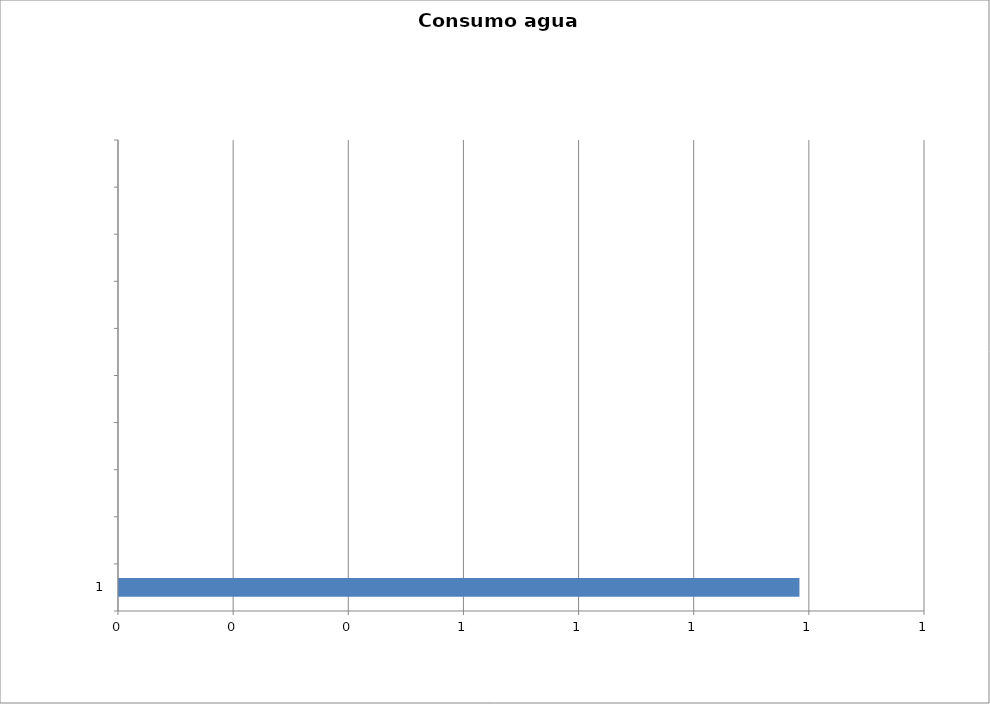
| Category | Series 0 |
|---|---|
| 1 | 1.182 |